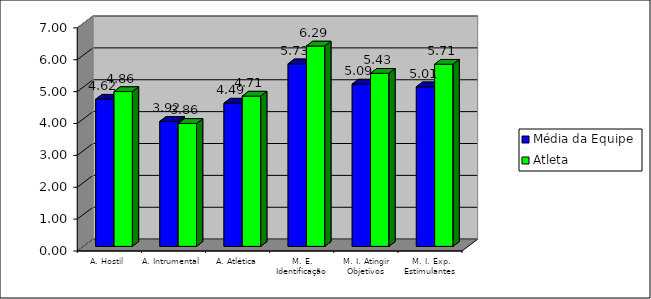
| Category | Média da Equipe | Atleta |
|---|---|---|
| A. Hostil | 4.617 | 4.857 |
| A. Intrumental | 3.922 | 3.857 |
| A. Atlética | 4.494 | 4.714 |
| M. E. Identificação | 5.727 | 6.286 |
| M. I. Atingir Objetivos | 5.091 | 5.429 |
| M. I. Exp. Estimulantes | 5.006 | 5.714 |